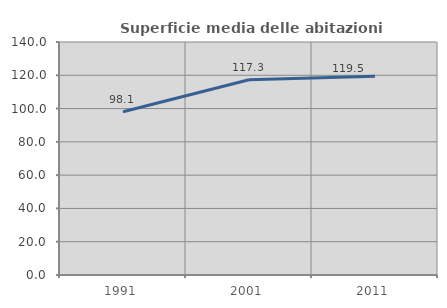
| Category | Superficie media delle abitazioni occupate |
|---|---|
| 1991.0 | 98.123 |
| 2001.0 | 117.287 |
| 2011.0 | 119.452 |